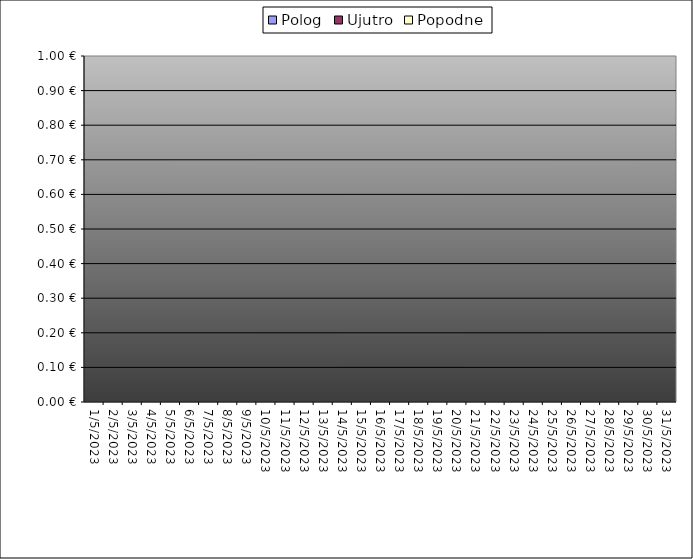
| Category | Polog | Ujutro | Popodne |
|---|---|---|---|
| 2023-05-01 |  | 0 | 0 |
| 2023-05-02 |  | 0 | 0 |
| 2023-05-03 |  | 0 | 0 |
| 2023-05-04 |  | 0 | 0 |
| 2023-05-05 |  | 0 | 0 |
| 2023-05-06 |  | 0 | 0 |
| 2023-05-07 |  | 0 | 0 |
| 2023-05-08 |  | 0 | 0 |
| 2023-05-09 |  | 0 | 0 |
| 2023-05-10 |  | 0 | 0 |
| 2023-05-11 |  | 0 | 0 |
| 2023-05-12 |  | 0 | 0 |
| 2023-05-13 |  | 0 | 0 |
| 2023-05-14 |  | 0 | 0 |
| 2023-05-15 |  | 0 | 0 |
| 2023-05-16 |  | 0 | 0 |
| 2023-05-17 |  | 0 | 0 |
| 2023-05-18 |  | 0 | 0 |
| 2023-05-19 |  | 0 | 0 |
| 2023-05-20 |  | 0 | 0 |
| 2023-05-21 |  | 0 | 0 |
| 2023-05-22 |  | 0 | 0 |
| 2023-05-23 |  | 0 | 0 |
| 2023-05-24 |  | 0 | 0 |
| 2023-05-25 |  | 0 | 0 |
| 2023-05-26 |  | 0 | 0 |
| 2023-05-27 |  | 0 | 0 |
| 2023-05-28 |  | 0 | 0 |
| 2023-05-29 |  | 0 | 0 |
| 2023-05-30 |  | 0 | 0 |
| 2023-05-31 |  | 0 | 0 |